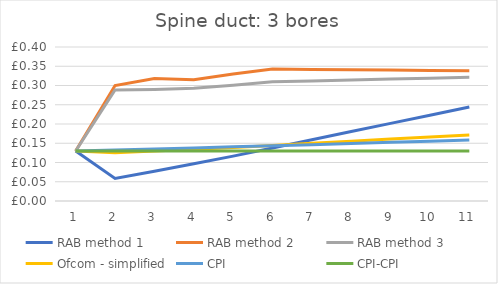
| Category | RAB method 1 | RAB method 2 | RAB method 3 | Ofcom - simplified | CPI | CPI-CPI |
|---|---|---|---|---|---|---|
| 0 | 0.13 | 0.13 | 0.13 | 0.13 | 0.13 | 0.13 |
| 1 | 0.058 | 0.3 | 0.288 | 0.125 | 0.133 | 0.13 |
| 2 | 0.077 | 0.318 | 0.29 | 0.13 | 0.135 | 0.13 |
| 3 | 0.097 | 0.315 | 0.293 | 0.134 | 0.138 | 0.13 |
| 4 | 0.117 | 0.33 | 0.301 | 0.139 | 0.141 | 0.13 |
| 5 | 0.137 | 0.343 | 0.31 | 0.144 | 0.144 | 0.13 |
| 6 | 0.159 | 0.342 | 0.312 | 0.15 | 0.146 | 0.13 |
| 7 | 0.18 | 0.341 | 0.314 | 0.155 | 0.149 | 0.13 |
| 8 | 0.202 | 0.34 | 0.317 | 0.161 | 0.152 | 0.13 |
| 9 | 0.223 | 0.339 | 0.319 | 0.166 | 0.155 | 0.13 |
| 10 | 0.244 | 0.338 | 0.321 | 0.172 | 0.158 | 0.13 |